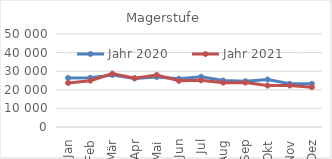
| Category | Jahr 2020 | Jahr 2021 |
|---|---|---|
| 0 | 26347.311 | 23694.457 |
| 1 | 26441.369 | 24893.638 |
| 2 | 27991.199 | 28694.439 |
| 3 | 26135.355 | 26223.484 |
| 4 | 26888.834 | 27985.085 |
| 5 | 25946.945 | 24835.731 |
| 6 | 27001.991 | 25083.106 |
| 7 | 25009.075 | 23849.412 |
| 8 | 24583.292 | 23871.524 |
| 9 | 25523.519 | 22262.344 |
| 10 | 23218.198 | 22314.308 |
| 11 | 23258.941 | 21421.744 |